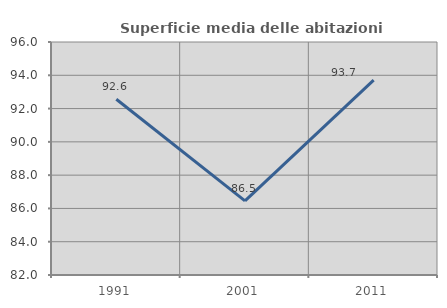
| Category | Superficie media delle abitazioni occupate |
|---|---|
| 1991.0 | 92.563 |
| 2001.0 | 86.458 |
| 2011.0 | 93.71 |